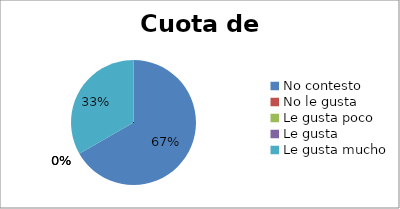
| Category | Series 0 |
|---|---|
| No contesto | 6 |
| No le gusta | 0 |
| Le gusta poco | 0 |
| Le gusta | 0 |
| Le gusta mucho | 3 |